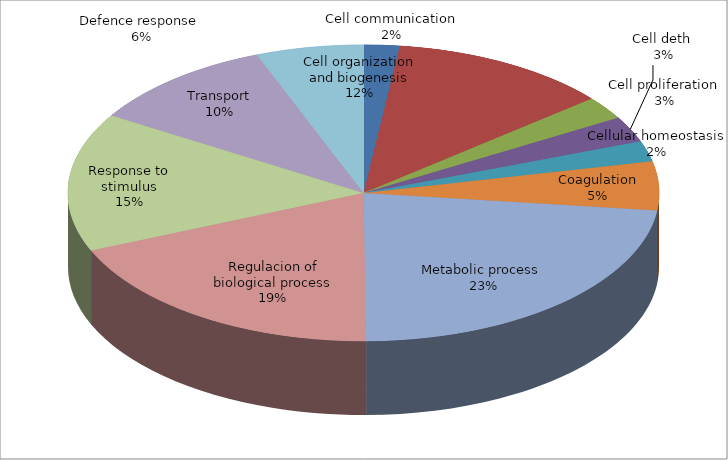
| Category | Series 0 |
|---|---|
| Cell communication | 1.961 |
| Cell organization and biogenesis | 12.045 |
| Cell proliferation  | 2.521 |
| Cell deth  | 2.801 |
| Cellular homeostasis | 2.241 |
| Coagulation | 5.322 |
| Metabolic process  | 22.969 |
| Regulacion of biological process | 18.768 |
| Response to stimulus | 15.126 |
| Transport | 10.364 |
| Defence response  | 5.882 |